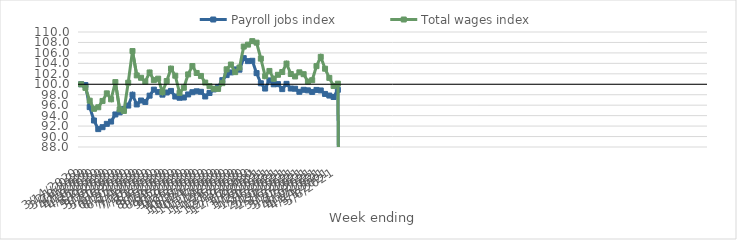
| Category | Payroll jobs index | Total wages index |
|---|---|---|
| 14/03/2020 | 100 | 100 |
| 21/03/2020 | 99.85 | 99.315 |
| 28/03/2020 | 95.629 | 96.857 |
| 04/04/2020 | 93.071 | 95.304 |
| 11/04/2020 | 91.421 | 95.601 |
| 18/04/2020 | 91.793 | 96.811 |
| 25/04/2020 | 92.43 | 98.264 |
| 02/05/2020 | 92.868 | 97.122 |
| 09/05/2020 | 94.226 | 100.415 |
| 16/05/2020 | 94.627 | 95.207 |
| 23/05/2020 | 95.28 | 94.896 |
| 30/05/2020 | 95.927 | 100.298 |
| 06/06/2020 | 97.996 | 106.354 |
| 13/06/2020 | 96.14 | 101.698 |
| 20/06/2020 | 96.894 | 101.239 |
| 27/06/2020 | 96.613 | 100.521 |
| 04/07/2020 | 97.825 | 102.26 |
| 11/07/2020 | 98.973 | 100.791 |
| 18/07/2020 | 98.5 | 101.072 |
| 25/07/2020 | 98.014 | 98.497 |
| 01/08/2020 | 98.427 | 100.622 |
| 08/08/2020 | 98.726 | 102.997 |
| 15/08/2020 | 97.654 | 101.641 |
| 22/08/2020 | 97.419 | 98.36 |
| 29/08/2020 | 97.464 | 99.338 |
| 05/09/2020 | 98.053 | 101.889 |
| 12/09/2020 | 98.482 | 103.485 |
| 19/09/2020 | 98.655 | 102.162 |
| 26/09/2020 | 98.56 | 101.596 |
| 03/10/2020 | 97.667 | 100.324 |
| 10/10/2020 | 98.334 | 99.638 |
| 17/10/2020 | 99.008 | 99.144 |
| 24/10/2020 | 99.485 | 99.112 |
| 31/10/2020 | 100.793 | 100.215 |
| 07/11/2020 | 101.754 | 102.864 |
| 14/11/2020 | 102.265 | 103.775 |
| 21/11/2020 | 102.845 | 102.323 |
| 28/11/2020 | 102.792 | 103.201 |
| 05/12/2020 | 104.996 | 107.213 |
| 12/12/2020 | 104.427 | 107.586 |
| 19/12/2020 | 104.492 | 108.253 |
| 26/12/2020 | 102.136 | 107.964 |
| 02/01/2021 | 100.188 | 104.904 |
| 09/01/2021 | 99.183 | 101.55 |
| 16/01/2021 | 100.741 | 102.55 |
| 23/01/2021 | 99.994 | 101.062 |
| 30/01/2021 | 100.029 | 101.817 |
| 06/02/2021 | 99.073 | 102.34 |
| 13/02/2021 | 100.082 | 103.957 |
| 20/02/2021 | 99.186 | 101.965 |
| 27/02/2021 | 99.147 | 101.498 |
| 06/03/2021 | 98.558 | 102.284 |
| 13/03/2021 | 98.94 | 101.931 |
| 20/03/2021 | 98.838 | 100.521 |
| 27/03/2021 | 98.533 | 100.78 |
| 03/04/2021 | 98.918 | 103.472 |
| 10/04/2021 | 98.819 | 105.244 |
| 17/04/2021 | 98.152 | 102.981 |
| 24/04/2021 | 97.841 | 101.222 |
| 01/05/2021 | 97.563 | 99.677 |
| 08/05/2021 | 98.938 | 100.114 |